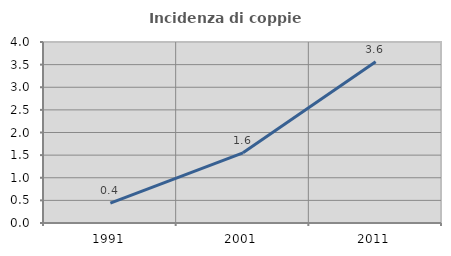
| Category | Incidenza di coppie miste |
|---|---|
| 1991.0 | 0.441 |
| 2001.0 | 1.552 |
| 2011.0 | 3.564 |